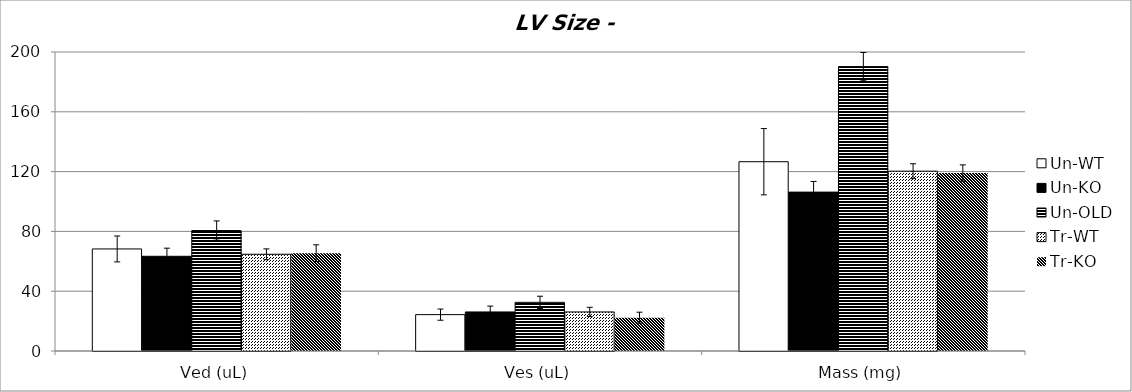
| Category | Un-WT | Un-KO | Un-OLD | Tr-WT | Tr-KO |
|---|---|---|---|---|---|
| 0 | 68.264 | 63.349 | 80.58 | 64.711 | 65.463 |
| 1 | 24.321 | 26.12 | 32.554 | 26.12 | 22.315 |
| 2 | 126.616 | 106.277 | 190.224 | 120.276 | 119.039 |